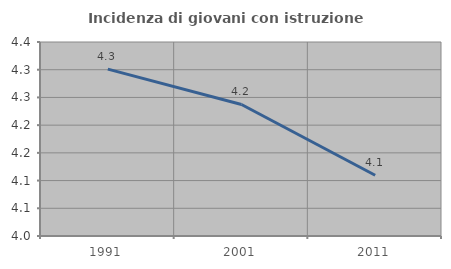
| Category | Incidenza di giovani con istruzione universitaria |
|---|---|
| 1991.0 | 4.301 |
| 2001.0 | 4.237 |
| 2011.0 | 4.11 |